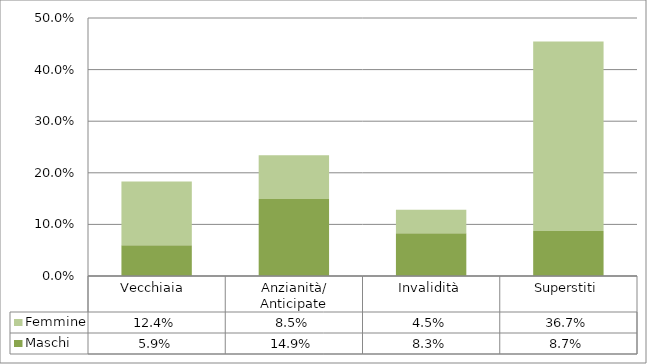
| Category | Maschi | Femmine |
|---|---|---|
| Vecchiaia  | 0.059 | 0.124 |
| Anzianità/ Anticipate | 0.149 | 0.085 |
| Invalidità | 0.083 | 0.045 |
| Superstiti | 0.087 | 0.367 |